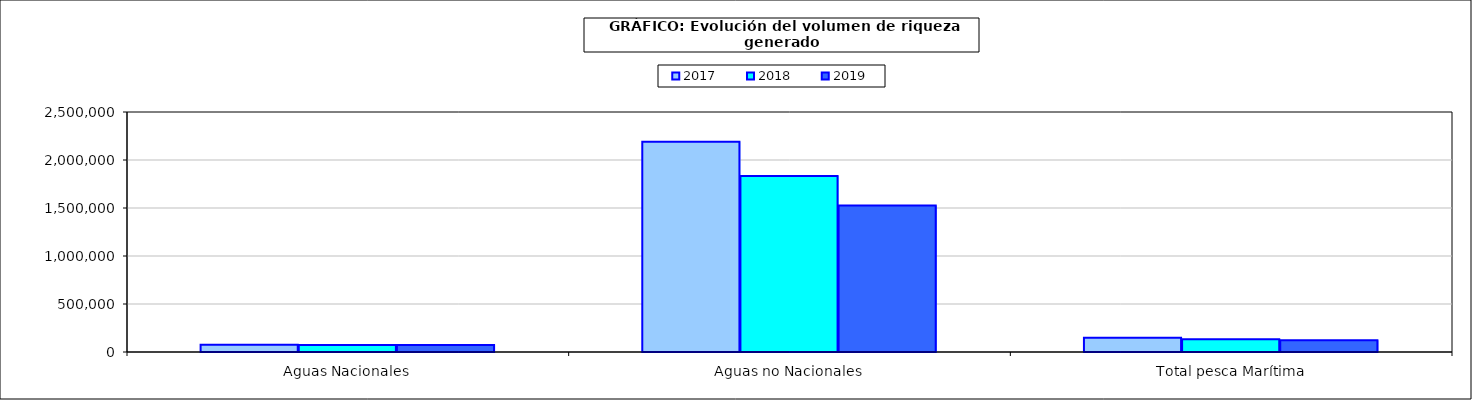
| Category | 2017 | 2018 | 2019 |
|---|---|---|---|
| 0 | 74797.768 | 71758.407 | 71713.906 |
| 1 | 2190184.753 | 1832597.322 | 1527052.017 |
| 2 | 148783.272 | 133139.433 | 123662.367 |